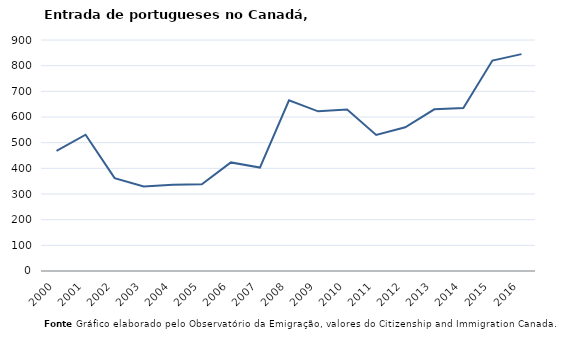
| Category | Entradas |
|---|---|
| 2000.0 | 468 |
| 2001.0 | 531 |
| 2002.0 | 362 |
| 2003.0 | 329 |
| 2004.0 | 336 |
| 2005.0 | 338 |
| 2006.0 | 423 |
| 2007.0 | 403 |
| 2008.0 | 665 |
| 2009.0 | 622 |
| 2010.0 | 629 |
| 2011.0 | 530 |
| 2012.0 | 560 |
| 2013.0 | 630 |
| 2014.0 | 635 |
| 2015.0 | 820 |
| 2016.0 | 845 |